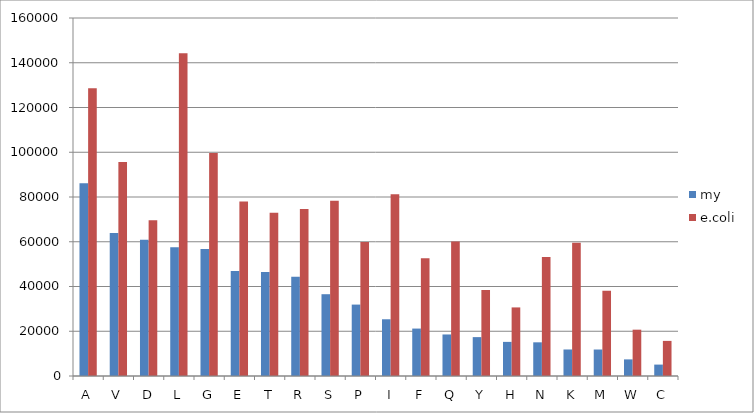
| Category | my | e.coli |
|---|---|---|
| A | 86129 | 128560 |
| V | 63956 | 95601 |
| D | 60854 | 69597 |
| L | 57575 | 144296 |
| G | 56708 | 99621 |
| E | 46968 | 77934 |
| T | 46452 | 72907 |
| R | 44377 | 74591 |
| S | 36556 | 78349 |
| P | 31917 | 59854 |
| I | 25353 | 81230 |
| F | 21198 | 52614 |
| Q | 18563 | 60058 |
| Y | 17376 | 38449 |
| H | 15249 | 30651 |
| N | 15052 | 53212 |
| K | 11853 | 59549 |
| M | 11837 | 38150 |
| W | 7423 | 20705 |
| C | 5098 | 15691 |